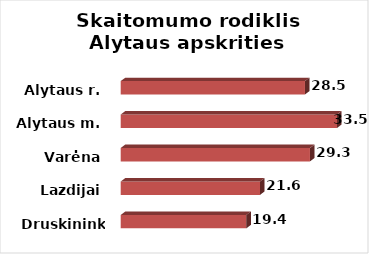
| Category | Series 0 |
|---|---|
| Druskininkai | 19.43 |
| Lazdijai | 21.55 |
| Varėna | 29.27 |
| Alytaus m. | 33.46 |
| Alytaus r. | 28.5 |